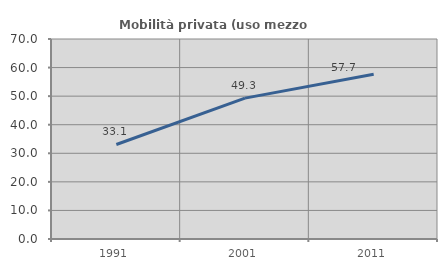
| Category | Mobilità privata (uso mezzo privato) |
|---|---|
| 1991.0 | 33.081 |
| 2001.0 | 49.31 |
| 2011.0 | 57.685 |